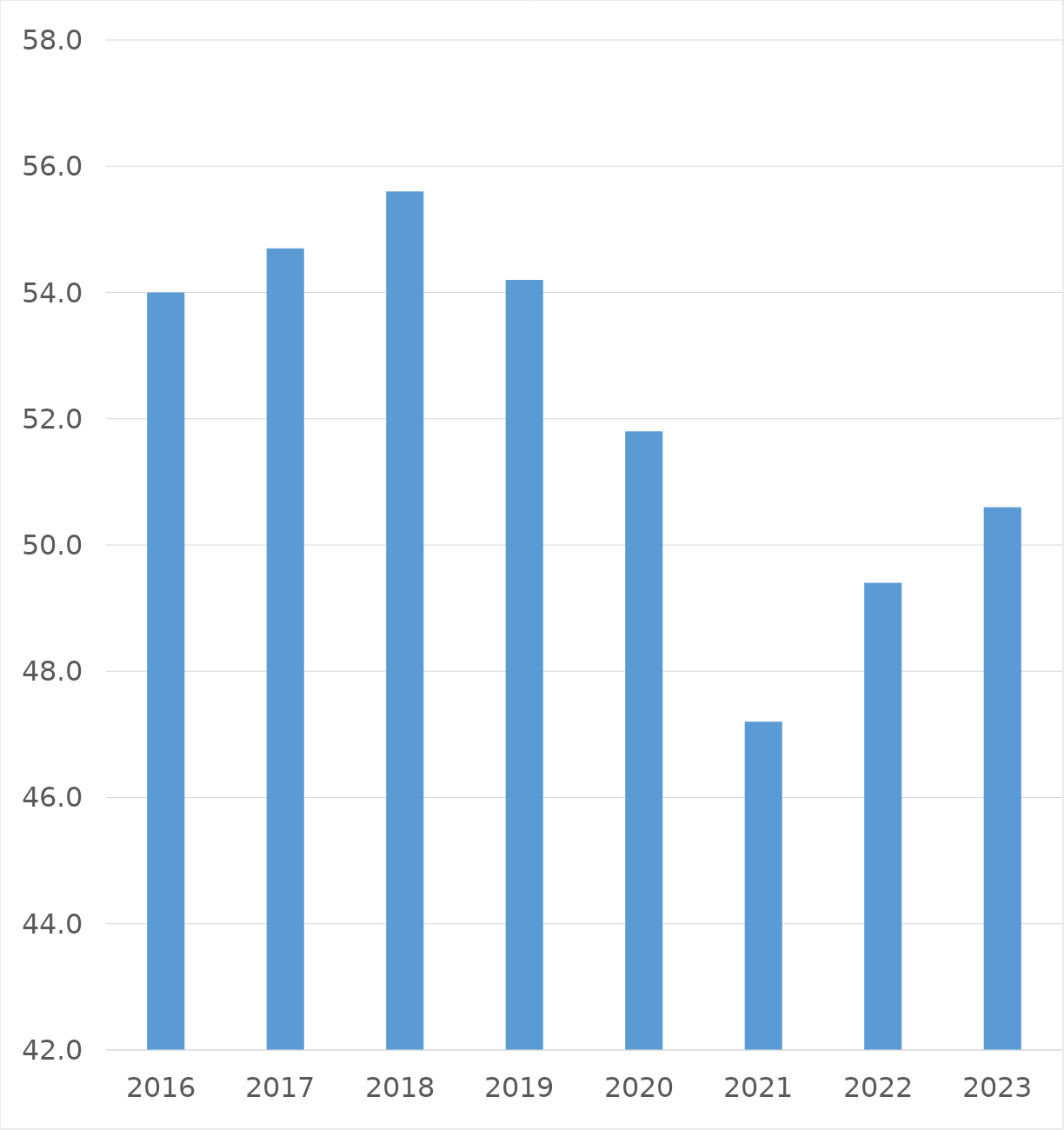
| Category | Series 0 |
|---|---|
| 2016 | 54 |
| 2017 | 54.7 |
| 2018 | 55.6 |
| 2019 | 54.2 |
| 2020 | 51.8 |
| 2021 | 47.2 |
| 2022 | 49.4 |
| 2023 | 50.6 |